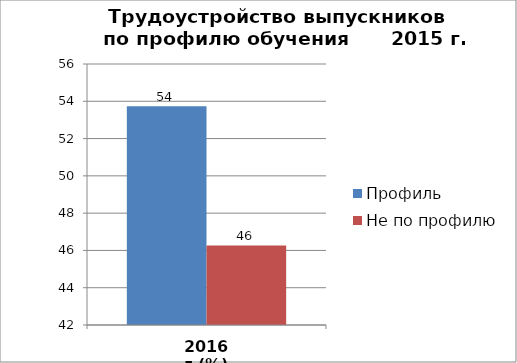
| Category | Профиль | Не по профилю |
|---|---|---|
| 2016 г.(%) | 53.731 | 46.269 |